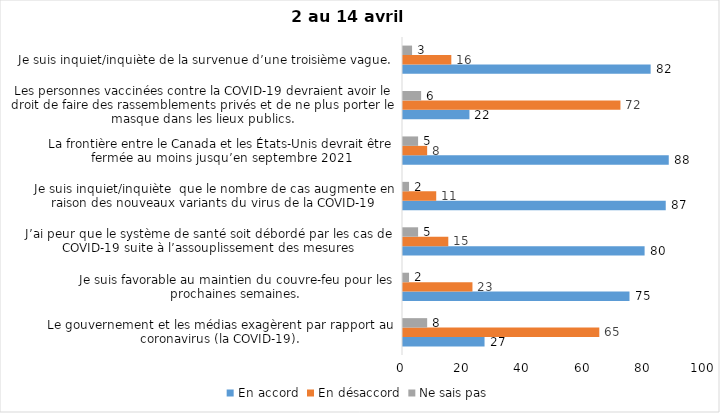
| Category | En accord | En désaccord | Ne sais pas |
|---|---|---|---|
| Le gouvernement et les médias exagèrent par rapport au coronavirus (la COVID-19). | 27 | 65 | 8 |
| Je suis favorable au maintien du couvre-feu pour les prochaines semaines. | 75 | 23 | 2 |
| J’ai peur que le système de santé soit débordé par les cas de COVID-19 suite à l’assouplissement des mesures | 80 | 15 | 5 |
| Je suis inquiet/inquiète  que le nombre de cas augmente en raison des nouveaux variants du virus de la COVID-19 | 87 | 11 | 2 |
| La frontière entre le Canada et les États-Unis devrait être fermée au moins jusqu’en septembre 2021 | 88 | 8 | 5 |
| Les personnes vaccinées contre la COVID-19 devraient avoir le droit de faire des rassemblements privés et de ne plus porter le masque dans les lieux publics. | 22 | 72 | 6 |
| Je suis inquiet/inquiète de la survenue d’une troisième vague. | 82 | 16 | 3 |